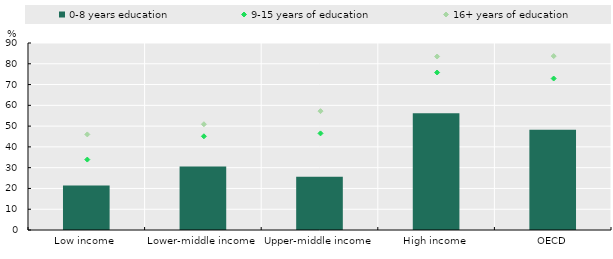
| Category | 0-8 years education |
|---|---|
| Low income | 21.4 |
| Lower-middle income | 30.6 |
| Upper-middle income | 25.6 |
| High income | 56.2 |
| OECD | 48.2 |